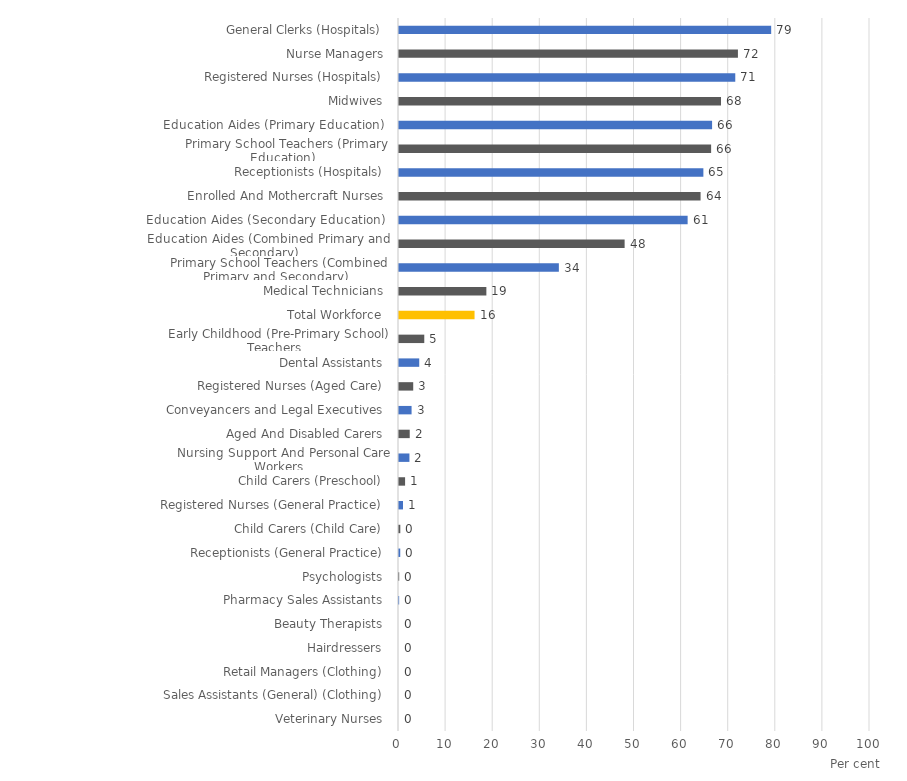
| Category |  % Employed in Public Sector  |
|---|---|
|  Veterinary Nurses  | 0 |
|  Sales Assistants (General) (Clothing)  | 0 |
|  Retail Managers (Clothing)  | 0 |
|  Hairdressers  | 0 |
|  Beauty Therapists  | 0 |
|  Pharmacy Sales Assistants  | 0.033 |
|  Psychologists  | 0.042 |
|  Receptionists (General Practice)  | 0.263 |
|  Child Carers (Child Care)  | 0.277 |
|  Registered Nurses (General Practice)  | 0.846 |
|  Child Carers (Preschool)  | 1.292 |
|  Nursing Support And Personal Care Workers  | 2.213 |
|  Aged And Disabled Carers  | 2.278 |
|  Conveyancers and Legal Executives  | 2.67 |
|  Registered Nurses (Aged Care)  | 3.018 |
|  Dental Assistants  | 4.295 |
|  Early Childhood (Pre-Primary School) Teachers  | 5.367 |
|  Total Workforce  | 16.041 |
|  Medical Technicians  | 18.55 |
|  Primary School Teachers (Combined Primary and Secondary)  | 33.94 |
|  Education Aides (Combined Primary and Secondary)  | 47.903 |
|  Education Aides (Secondary Education)  | 61.281 |
|  Enrolled And Mothercraft Nurses  | 64.028 |
|  Receptionists (Hospitals)  | 64.624 |
|  Primary School Teachers (Primary Education)  | 66.269 |
|  Education Aides (Primary Education)  | 66.473 |
|  Midwives  | 68.366 |
|  Registered Nurses (Hospitals)  | 71.395 |
|  Nurse Managers  | 71.958 |
|  General Clerks (Hospitals)  | 79.019 |